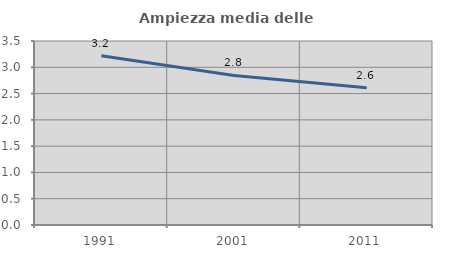
| Category | Ampiezza media delle famiglie |
|---|---|
| 1991.0 | 3.218 |
| 2001.0 | 2.845 |
| 2011.0 | 2.613 |